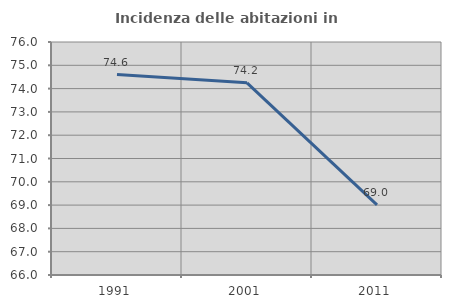
| Category | Incidenza delle abitazioni in proprietà  |
|---|---|
| 1991.0 | 74.605 |
| 2001.0 | 74.247 |
| 2011.0 | 69.011 |